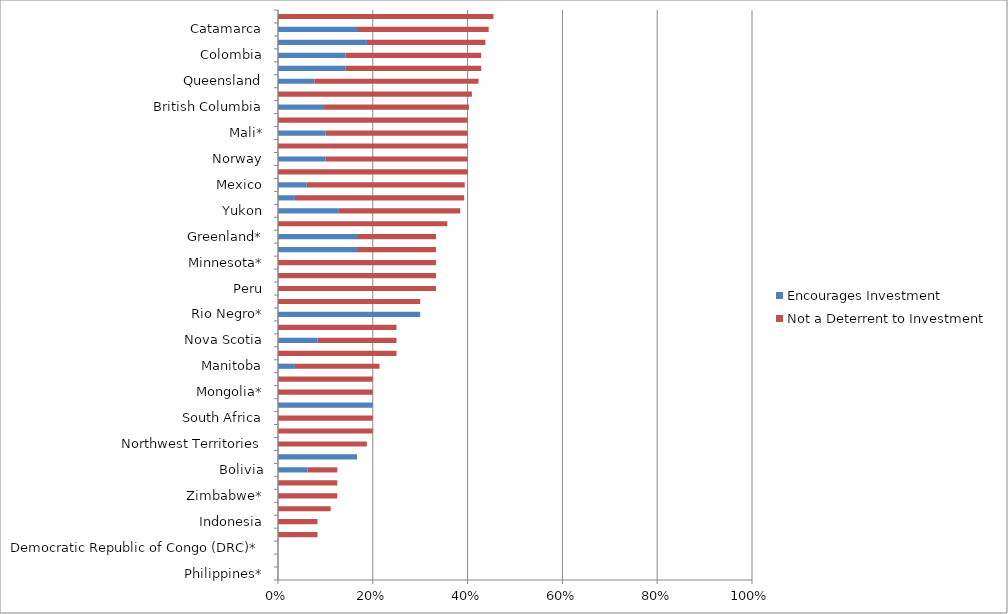
| Category | Encourages Investment | Not a Deterrent to Investment |
|---|---|---|
| Philippines* | 0 | 0 |
| Liberia* | 0 | 0 |
| Democratic Republic of Congo (DRC)* | 0 | 0 |
| Papua New Guinea | 0 | 0.083 |
| Indonesia | 0 | 0.083 |
| Venezuela* | 0 | 0.111 |
| Zimbabwe* | 0 | 0.125 |
| Nicaragua* | 0 | 0.125 |
| Bolivia | 0.062 | 0.062 |
| Tanzania* | 0.167 | 0 |
| Northwest Territories | 0 | 0.188 |
| Turkey | 0 | 0.2 |
| South Africa | 0 | 0.2 |
| New Zealand* | 0.2 | 0 |
| Mongolia* | 0 | 0.2 |
| Kyrgyzstan* | 0 | 0.2 |
| Manitoba | 0.036 | 0.179 |
| Russia* | 0 | 0.25 |
| Nova Scotia | 0.083 | 0.167 |
| China* | 0 | 0.25 |
| Rio Negro* | 0.3 | 0 |
| Mendoza* | 0 | 0.3 |
| Peru | 0 | 0.333 |
| Panama* | 0 | 0.333 |
| Minnesota* | 0 | 0.333 |
| Guyana* | 0.167 | 0.167 |
| Greenland* | 0.167 | 0.167 |
| Chubut | 0 | 0.357 |
| Yukon | 0.128 | 0.256 |
| New South Wales | 0.036 | 0.357 |
| Mexico | 0.061 | 0.333 |
| Spain* | 0 | 0.4 |
| Norway | 0.1 | 0.3 |
| Michigan* | 0 | 0.4 |
| Mali* | 0.1 | 0.3 |
| Burkina Faso* | 0 | 0.4 |
| British Columbia | 0.097 | 0.306 |
| Brazil | 0 | 0.409 |
| Queensland | 0.077 | 0.346 |
| Tasmania* | 0.143 | 0.286 |
| Colombia | 0.143 | 0.286 |
| Sweden | 0.188 | 0.25 |
| Catamarca | 0.167 | 0.278 |
| Ghana | 0 | 0.455 |